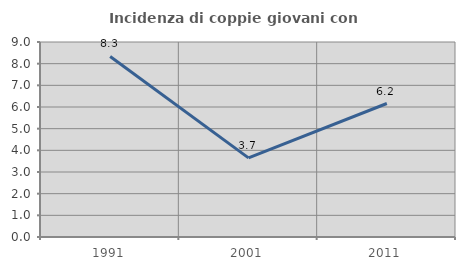
| Category | Incidenza di coppie giovani con figli |
|---|---|
| 1991.0 | 8.333 |
| 2001.0 | 3.653 |
| 2011.0 | 6.161 |